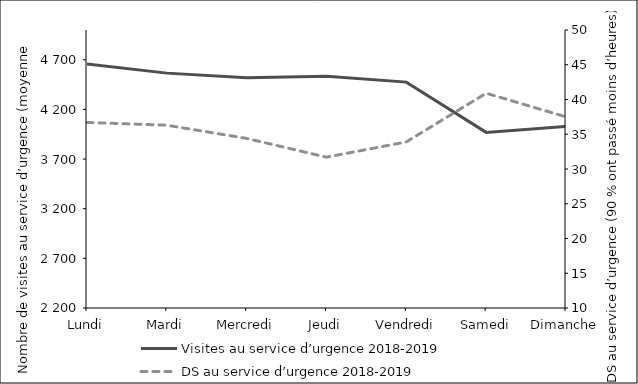
| Category | Visites au service d’urgence 2018-2019 |
|---|---|
| Lundi | 4658.423 |
| Mardi | 4565.654 |
| Mercredi | 4518.192 |
| Jeudi | 4534.788 |
| Vendredi | 4474.981 |
| Samedi | 3968.885 |
| Dimanche | 4028.585 |